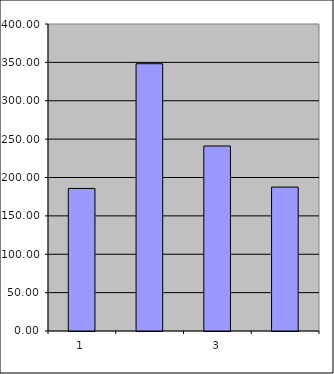
| Category | Series 0 |
|---|---|
| 0 | 185.75 |
| 1 | 348.259 |
| 2 | 241.049 |
| 3 | 187.517 |